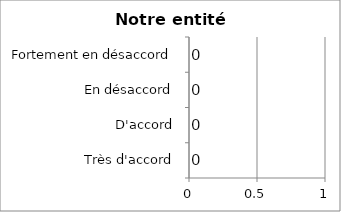
| Category | B |
|---|---|
| Très d'accord | 0 |
| D'accord | 0 |
| En désaccord | 0 |
| Fortement en désaccord | 0 |